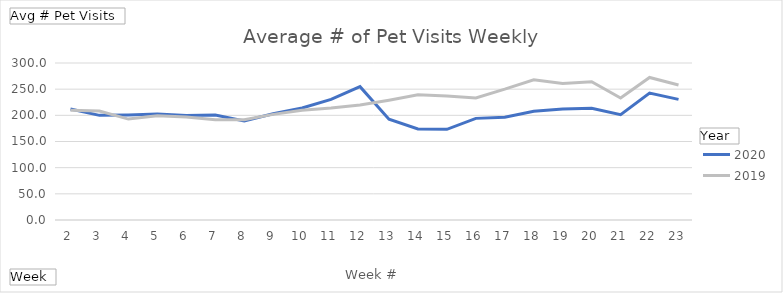
| Category | 2020 | 2019 |
|---|---|---|
| 2 | 212.247 | 209.548 |
| 3 | 199.946 | 208.172 |
| 4 | 200.828 | 192.849 |
| 5 | 202.452 | 199.129 |
| 6 | 199.785 | 196.978 |
| 7 | 200.688 | 191.613 |
| 8 | 189.398 | 191.796 |
| 9 | 202.935 | 201.806 |
| 10 | 214.161 | 209.817 |
| 11 | 230.366 | 213.796 |
| 12 | 254.742 | 219.57 |
| 13 | 192.71 | 229.011 |
| 14 | 174.086 | 239.301 |
| 15 | 173.269 | 237.097 |
| 16 | 194.194 | 233.344 |
| 17 | 196.247 | 249.957 |
| 18 | 207.699 | 268.022 |
| 19 | 211.871 | 261.065 |
| 20 | 213.699 | 264.247 |
| 21 | 201.226 | 233.065 |
| 22 | 242.656 | 272.409 |
| 23 | 230.462 | 257.957 |